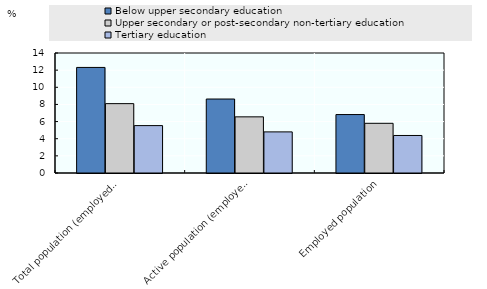
| Category | Below upper secondary education | Upper secondary or post-secondary non-tertiary education | Tertiary education |
|---|---|---|---|
| Total population (employed+unemployed+inactive) | 12.316 | 8.093 | 5.53 |
| Active population (employed+unemployed) | 8.631 | 6.55 | 4.797 |
| Employed population | 6.818 | 5.798 | 4.378 |